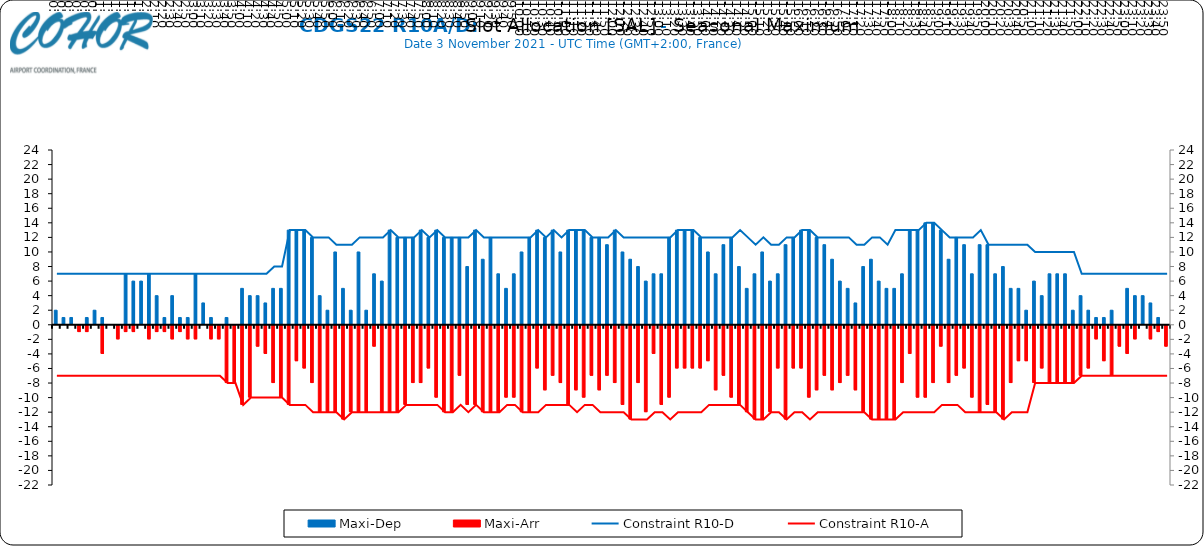
| Category | Maxi-Dep | Maxi-Arr |
|---|---|---|
| 0.0 | 2 | 0 |
| 0.006944444444444444 | 1 | 0 |
| 0.013888888888888888 | 1 | 0 |
| 0.020833333333333332 | 0 | -1 |
| 0.027777777777777776 | 1 | -1 |
| 0.034722222222222224 | 2 | 0 |
| 0.041666666666666664 | 1 | -4 |
| 0.04861111111111111 | 0 | 0 |
| 0.05555555555555555 | 0 | -2 |
| 0.0625 | 7 | -1 |
| 0.06944444444444443 | 6 | -1 |
| 0.0763888888888889 | 6 | 0 |
| 0.08333333333333333 | 7 | -2 |
| 0.09027777777777778 | 4 | -1 |
| 0.09722222222222222 | 1 | -1 |
| 0.10416666666666667 | 4 | -2 |
| 0.1111111111111111 | 1 | -1 |
| 0.11805555555555557 | 1 | -2 |
| 0.125 | 7 | -2 |
| 0.13194444444444445 | 3 | 0 |
| 0.1388888888888889 | 1 | -2 |
| 0.14583333333333334 | 0 | -2 |
| 0.15277777777777776 | 1 | -8 |
| 0.15972222222222224 | 0 | -8 |
| 0.16666666666666666 | 5 | -11 |
| 0.17361111111111113 | 4 | -10 |
| 0.18055555555555555 | 4 | -3 |
| 0.1875 | 3 | -4 |
| 0.19444444444444445 | 5 | -8 |
| 0.20138888888888887 | 5 | -10 |
| 0.20833333333333334 | 13 | -11 |
| 0.2152777777777778 | 13 | -5 |
| 0.2222222222222222 | 13 | -6 |
| 0.22916666666666666 | 12 | -8 |
| 0.23611111111111113 | 4 | -12 |
| 0.24305555555555555 | 2 | -12 |
| 0.25 | 10 | -12 |
| 0.2569444444444445 | 5 | -13 |
| 0.2638888888888889 | 2 | -12 |
| 0.2708333333333333 | 10 | -12 |
| 0.2777777777777778 | 2 | -12 |
| 0.2847222222222222 | 7 | -3 |
| 0.2916666666666667 | 6 | -12 |
| 0.2986111111111111 | 13 | -12 |
| 0.3055555555555555 | 12 | -12 |
| 0.3125 | 12 | -11 |
| 0.3194444444444445 | 12 | -8 |
| 0.3263888888888889 | 13 | -8 |
| 0.3333333333333333 | 12 | -6 |
| 0.34027777777777773 | 13 | -10 |
| 0.34722222222222227 | 12 | -12 |
| 0.3541666666666667 | 12 | -12 |
| 0.3611111111111111 | 12 | -7 |
| 0.3680555555555556 | 8 | -11 |
| 0.375 | 13 | -11 |
| 0.3819444444444444 | 9 | -12 |
| 0.3888888888888889 | 12 | -12 |
| 0.3958333333333333 | 7 | -12 |
| 0.40277777777777773 | 5 | -10 |
| 0.40972222222222227 | 7 | -10 |
| 0.4166666666666667 | 10 | -12 |
| 0.4236111111111111 | 12 | -12 |
| 0.4305555555555556 | 13 | -6 |
| 0.4375 | 12 | -9 |
| 0.4444444444444444 | 13 | -7 |
| 0.4513888888888889 | 10 | -8 |
| 0.4583333333333333 | 13 | -11 |
| 0.46527777777777773 | 13 | -9 |
| 0.47222222222222227 | 13 | -10 |
| 0.4791666666666667 | 12 | -7 |
| 0.4861111111111111 | 12 | -9 |
| 0.4930555555555556 | 11 | -7 |
| 0.5 | 13 | -8 |
| 0.5069444444444444 | 10 | -11 |
| 0.513888888888889 | 9 | -13 |
| 0.5208333333333334 | 8 | -8 |
| 0.5277777777777778 | 6 | -12 |
| 0.5347222222222222 | 7 | -4 |
| 0.5416666666666666 | 7 | -11 |
| 0.548611111111111 | 12 | -10 |
| 0.5555555555555556 | 13 | -6 |
| 0.5625 | 13 | -6 |
| 0.5694444444444444 | 13 | -6 |
| 0.576388888888889 | 12 | -6 |
| 0.5833333333333334 | 10 | -5 |
| 0.5902777777777778 | 7 | -9 |
| 0.5972222222222222 | 11 | -7 |
| 0.6041666666666666 | 12 | -10 |
| 0.611111111111111 | 8 | -11 |
| 0.6180555555555556 | 5 | -12 |
| 0.625 | 7 | -13 |
| 0.6319444444444444 | 10 | -13 |
| 0.638888888888889 | 6 | -12 |
| 0.6458333333333334 | 7 | -6 |
| 0.6527777777777778 | 11 | -13 |
| 0.6597222222222222 | 12 | -6 |
| 0.6666666666666666 | 13 | -6 |
| 0.6736111111111112 | 13 | -10 |
| 0.6805555555555555 | 12 | -9 |
| 0.6875 | 11 | -7 |
| 0.6944444444444445 | 9 | -9 |
| 0.7013888888888888 | 6 | -8 |
| 0.7083333333333334 | 5 | -7 |
| 0.7152777777777778 | 3 | -9 |
| 0.7222222222222222 | 8 | -12 |
| 0.7291666666666666 | 9 | -13 |
| 0.7361111111111112 | 6 | -13 |
| 0.7430555555555555 | 5 | -13 |
| 0.75 | 5 | -13 |
| 0.7569444444444445 | 7 | -8 |
| 0.7638888888888888 | 13 | -4 |
| 0.7708333333333334 | 13 | -10 |
| 0.7777777777777778 | 14 | -10 |
| 0.7847222222222222 | 14 | -8 |
| 0.7916666666666666 | 13 | -3 |
| 0.7986111111111112 | 9 | -8 |
| 0.8055555555555555 | 12 | -7 |
| 0.8125 | 11 | -6 |
| 0.8194444444444445 | 7 | -10 |
| 0.8263888888888888 | 11 | -12 |
| 0.8333333333333334 | 11 | -11 |
| 0.8402777777777778 | 7 | -12 |
| 0.8472222222222222 | 8 | -13 |
| 0.8541666666666666 | 5 | -8 |
| 0.8611111111111112 | 5 | -5 |
| 0.8680555555555555 | 2 | -5 |
| 0.875 | 6 | -8 |
| 0.8819444444444445 | 4 | -6 |
| 0.8888888888888888 | 7 | -8 |
| 0.8958333333333334 | 7 | -8 |
| 0.9027777777777778 | 7 | -8 |
| 0.9097222222222222 | 2 | -8 |
| 0.9166666666666666 | 4 | -7 |
| 0.9236111111111112 | 2 | -6 |
| 0.9305555555555555 | 1 | -2 |
| 0.9375 | 1 | -5 |
| 0.9444444444444445 | 2 | -7 |
| 0.9513888888888888 | 0 | -3 |
| 0.9583333333333334 | 5 | -4 |
| 0.9652777777777778 | 4 | -2 |
| 0.9722222222222222 | 4 | 0 |
| 0.9791666666666666 | 3 | -2 |
| 0.9861111111111112 | 1 | -1 |
| 0.9930555555555555 | 0 | -3 |